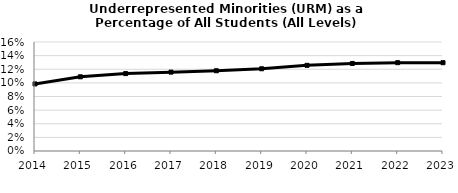
| Category | Series 1 |
|---|---|
| 2014.0 | 0.098 |
| 2015.0 | 0.109 |
| 2016.0 | 0.114 |
| 2017.0 | 0.116 |
| 2018.0 | 0.118 |
| 2019.0 | 0.121 |
| 2020.0 | 0.126 |
| 2021.0 | 0.129 |
| 2022.0 | 0.13 |
| 2023.0 | 0.13 |